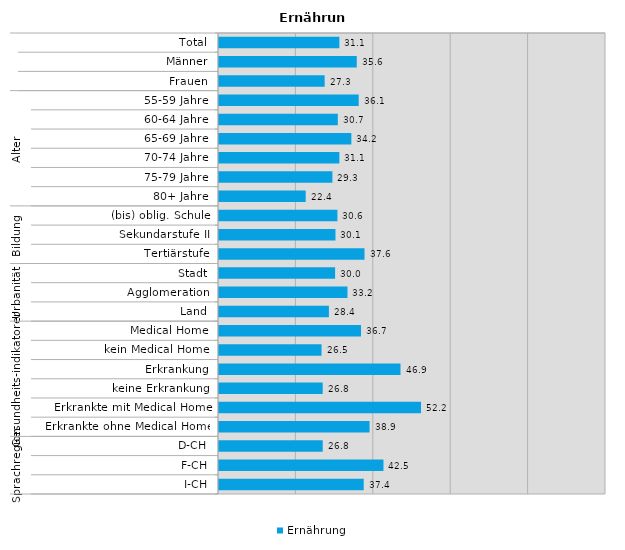
| Category | Ernährung |
|---|---|
| 0 | 31.1 |
| 1 | 35.6 |
| 2 | 27.3 |
| 3 | 36.1 |
| 4 | 30.7 |
| 5 | 34.2 |
| 6 | 31.1 |
| 7 | 29.3 |
| 8 | 22.4 |
| 9 | 30.6 |
| 10 | 30.1 |
| 11 | 37.6 |
| 12 | 30 |
| 13 | 33.2 |
| 14 | 28.4 |
| 15 | 36.7 |
| 16 | 26.5 |
| 17 | 46.9 |
| 18 | 26.8 |
| 19 | 52.2 |
| 20 | 38.9 |
| 21 | 26.8 |
| 22 | 42.5 |
| 23 | 37.4 |